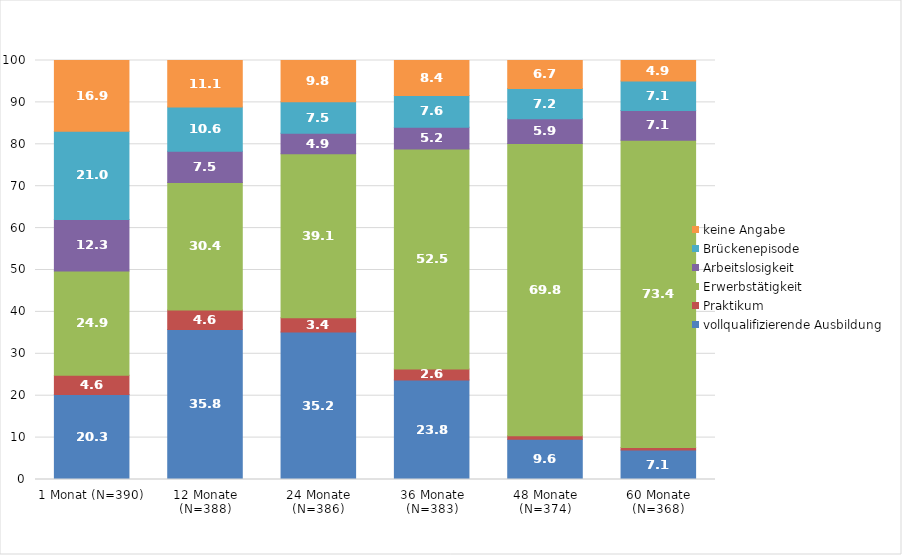
| Category | vollqualifizierende Ausbildung | Praktikum | Erwerbstätigkeit | Arbeitslosigkeit | Brückenepisode | keine Angabe |
|---|---|---|---|---|---|---|
| 1 Monat (N=390) | 20.26 | 4.62 | 24.87 | 12.31 | 21.03 | 16.92 |
| 12 Monate (N=388) | 35.82 | 4.64 | 30.41 | 7.47 | 10.57 | 11.08 |
| 24 Monate (N=386) | 35.23 | 3.37 | 39.12 | 4.92 | 7.51 | 9.84 |
| 36 Monate (N=383) | 23.76 | 2.61 | 52.48 | 5.22 | 7.57 | 8.36 |
| 48 Monate (N=374) | 9.63 | 0.8 | 69.79 | 5.88 | 7.22 | 6.68 |
| 60 Monate (N=368) | 7.07 | 0.54 | 73.37 | 7.07 | 7.07 | 4.89 |